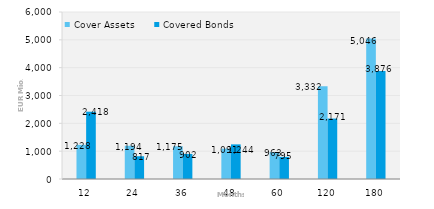
| Category | Cover Assets | Covered Bonds |
|---|---|---|
| 12.0 | 1227.828 | 2417.7 |
| 24.0 | 1194.364 | 817.292 |
| 36.0 | 1175.489 | 901.8 |
| 48.0 | 1091.196 | 1243.703 |
| 60.0 | 963.031 | 795 |
| 120.0 | 3332.39 | 2171.376 |
| 180.0 | 5046.24 | 3876.113 |